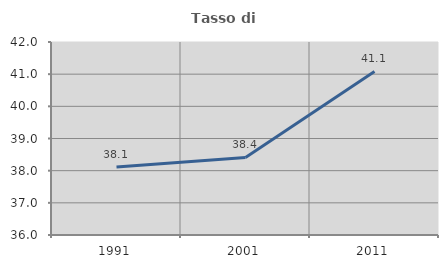
| Category | Tasso di occupazione   |
|---|---|
| 1991.0 | 38.11 |
| 2001.0 | 38.411 |
| 2011.0 | 41.085 |